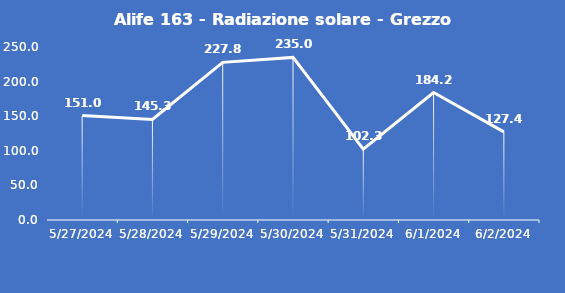
| Category | Alife 163 - Radiazione solare - Grezzo (W/m2) |
|---|---|
| 5/27/24 | 151 |
| 5/28/24 | 145.3 |
| 5/29/24 | 227.8 |
| 5/30/24 | 235 |
| 5/31/24 | 102.3 |
| 6/1/24 | 184.2 |
| 6/2/24 | 127.4 |